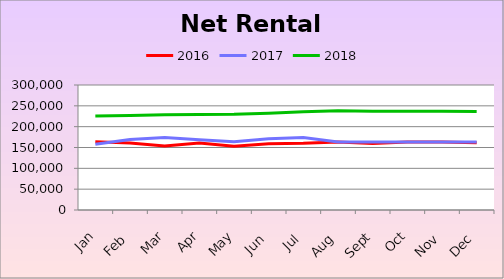
| Category | 2016 | 2017 | 2018 |
|---|---|---|---|
| 2010-01-20 | 163630 | 157622 | 225734 |
| 2010-02-20 | 160912 | 168948 | 227034 |
| 2010-03-20 | 153403 | 174051 | 228334 |
| 2010-04-20 | 160529 | 168375 | 229094.455 |
| 2010-05-20 | 153013 | 164104 | 229629.909 |
| 2010-06-20 | 158898 | 171064 | 232344.455 |
| 2010-07-20 | 159973 | 173938 | 235528.773 |
| 2010-08-20 | 163029 | 163365 | 238168.318 |
| 2010-09-20 | 159306 | 163365 | 237173.545 |
| 2010-10-20 | 163398 | 163365 | 237009 |
| 2010-11-20 | 162977 | 163365 | 236844.455 |
| 2010-12-20 | 161386 | 163365 | 236604.909 |